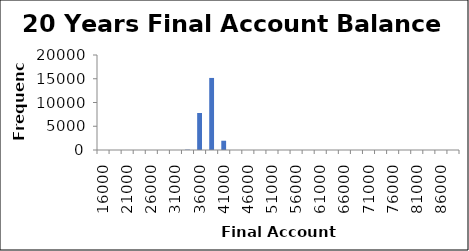
| Category | Frequency |
|---|---|
| 16000.0 | 0 |
| 18500.0 | 0 |
| 21000.0 | 0 |
| 23500.0 | 0 |
| 26000.0 | 0 |
| 28500.0 | 0 |
| 31000.0 | 0 |
| 33500.0 | 79 |
| 36000.0 | 7791 |
| 38500.0 | 15171 |
| 41000.0 | 1953 |
| 43500.0 | 6 |
| 46000.0 | 0 |
| 48500.0 | 0 |
| 51000.0 | 0 |
| 53500.0 | 0 |
| 56000.0 | 0 |
| 58500.0 | 0 |
| 61000.0 | 0 |
| 63500.0 | 0 |
| 66000.0 | 0 |
| 68500.0 | 0 |
| 71000.0 | 0 |
| 73500.0 | 0 |
| 76000.0 | 0 |
| 78500.0 | 0 |
| 81000.0 | 0 |
| 83500.0 | 0 |
| 86000.0 | 0 |
| More | 0 |